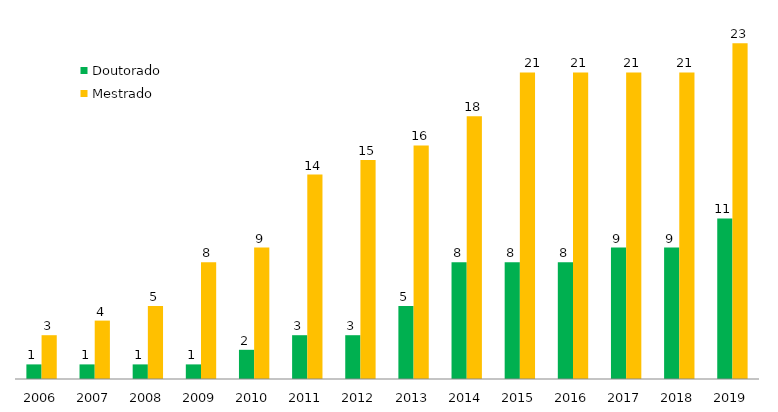
| Category | Doutorado | Mestrado |
|---|---|---|
| 2006.0 | 1 | 3 |
| 2007.0 | 1 | 4 |
| 2008.0 | 1 | 5 |
| 2009.0 | 1 | 8 |
| 2010.0 | 2 | 9 |
| 2011.0 | 3 | 14 |
| 2012.0 | 3 | 15 |
| 2013.0 | 5 | 16 |
| 2014.0 | 8 | 18 |
| 2015.0 | 8 | 21 |
| 2016.0 | 8 | 21 |
| 2017.0 | 9 | 21 |
| 2018.0 | 9 | 21 |
| 2019.0 | 11 | 23 |